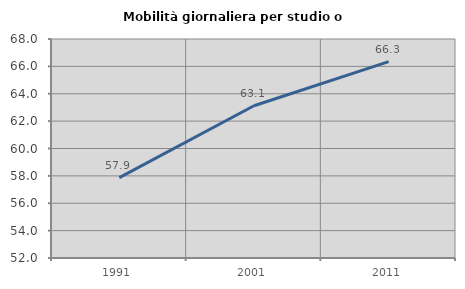
| Category | Mobilità giornaliera per studio o lavoro |
|---|---|
| 1991.0 | 57.87 |
| 2001.0 | 63.126 |
| 2011.0 | 66.344 |